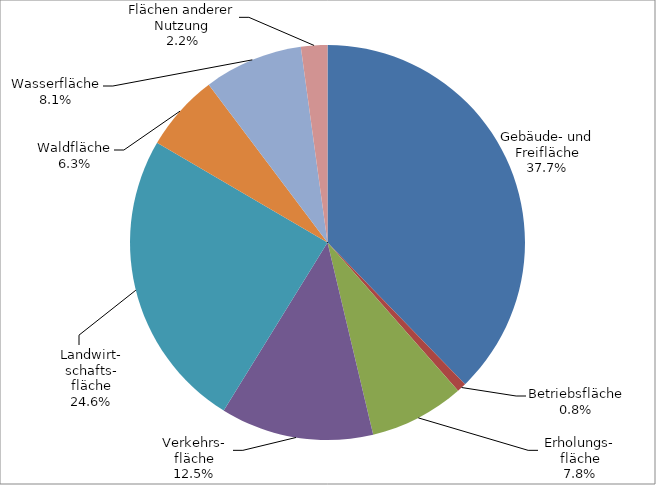
| Category | 2012 |
|---|---|
| Gebäude- und Freifläche | 28504.182 |
| Betriebsfläche | 579.638 |
| Erholungs-
fläche | 5875.065 |
| Verkehrs-
fläche | 9456.924 |
| Landwirt-
schafts-
fläche | 18599.335 |
| Waldfläche | 4762.287 |
| Wasserfläche | 6121.314 |
| Flächen anderer Nutzung | 1631.492 |